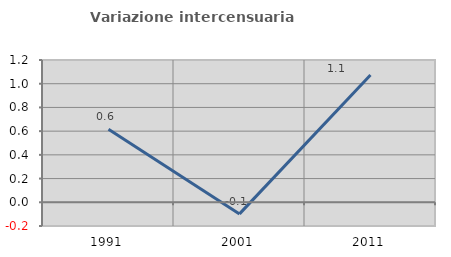
| Category | Variazione intercensuaria annua |
|---|---|
| 1991.0 | 0.616 |
| 2001.0 | -0.098 |
| 2011.0 | 1.073 |